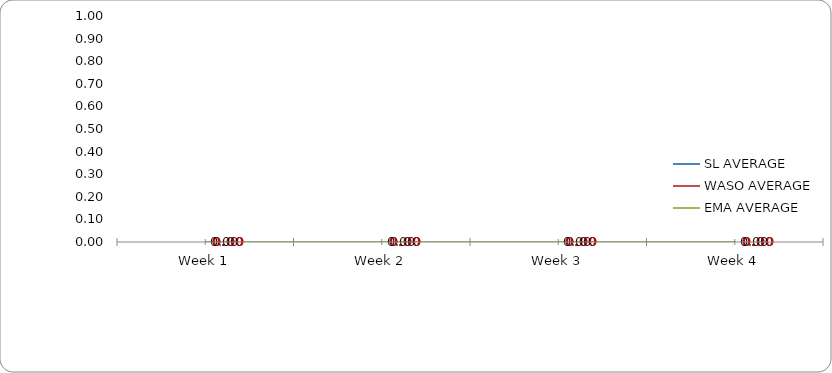
| Category | SL AVERAGE | WASO AVERAGE | EMA AVERAGE |
|---|---|---|---|
| Week 1 | 0 | 0 | 0 |
| Week 2 | 0 | 0 | 0 |
| Week 3 | 0 | 0 | 0 |
| Week 4 | 0 | 0 | 0 |